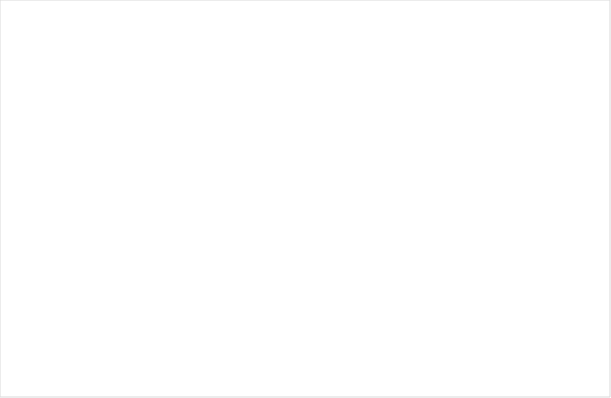
| Category | Итог |
|---|---|
| 8 | 2 |
| 9 | 5 |
| 10 | 9 |